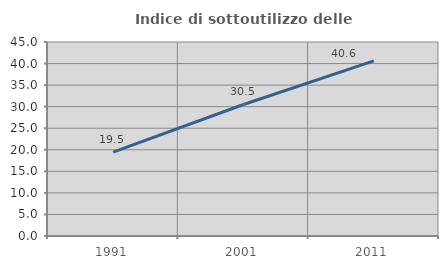
| Category | Indice di sottoutilizzo delle abitazioni  |
|---|---|
| 1991.0 | 19.46 |
| 2001.0 | 30.51 |
| 2011.0 | 40.625 |